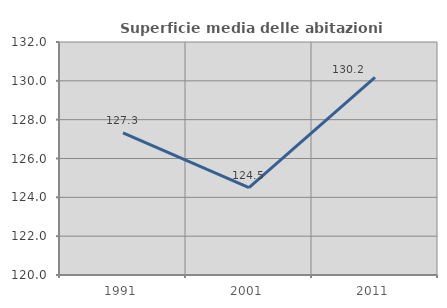
| Category | Superficie media delle abitazioni occupate |
|---|---|
| 1991.0 | 127.314 |
| 2001.0 | 124.504 |
| 2011.0 | 130.172 |